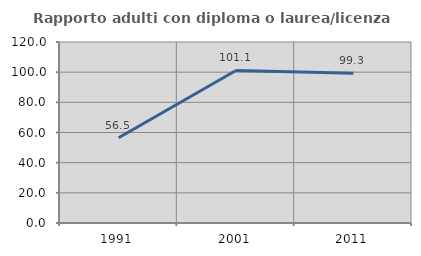
| Category | Rapporto adulti con diploma o laurea/licenza media  |
|---|---|
| 1991.0 | 56.484 |
| 2001.0 | 101.111 |
| 2011.0 | 99.292 |